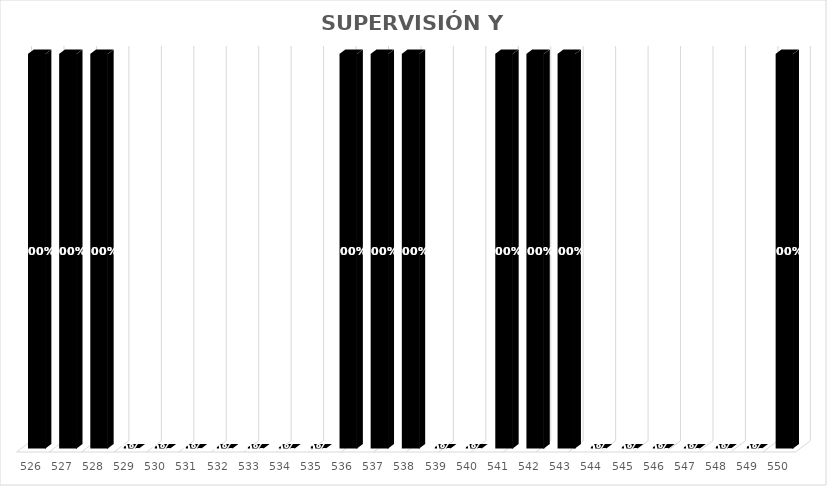
| Category | % Avance |
|---|---|
| 526.0 | 1 |
| 527.0 | 1 |
| 528.0 | 1 |
| 529.0 | 0 |
| 530.0 | 0 |
| 531.0 | 0 |
| 532.0 | 0 |
| 533.0 | 0 |
| 534.0 | 0 |
| 535.0 | 0 |
| 536.0 | 1 |
| 537.0 | 1 |
| 538.0 | 1 |
| 539.0 | 0 |
| 540.0 | 0 |
| 541.0 | 1 |
| 542.0 | 1 |
| 543.0 | 1 |
| 544.0 | 0 |
| 545.0 | 0 |
| 546.0 | 0 |
| 547.0 | 0 |
| 548.0 | 0 |
| 549.0 | 0 |
| 550.0 | 1 |